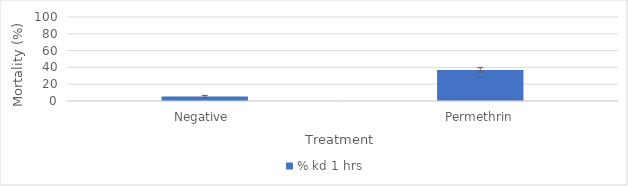
| Category | % kd 1 hrs |
|---|---|
| Negative  | 5.455 |
| Permethrin | 37.037 |